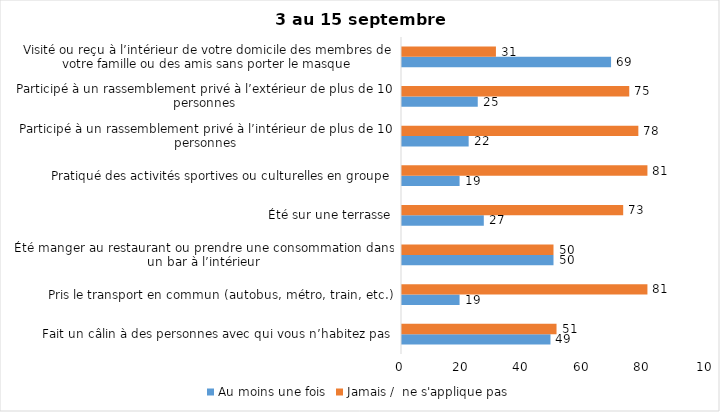
| Category | Au moins une fois | Jamais /  ne s'applique pas |
|---|---|---|
| Fait un câlin à des personnes avec qui vous n’habitez pas | 49 | 51 |
| Pris le transport en commun (autobus, métro, train, etc.) | 19 | 81 |
| Été manger au restaurant ou prendre une consommation dans un bar à l’intérieur | 50 | 50 |
| Été sur une terrasse | 27 | 73 |
| Pratiqué des activités sportives ou culturelles en groupe | 19 | 81 |
| Participé à un rassemblement privé à l’intérieur de plus de 10 personnes | 22 | 78 |
| Participé à un rassemblement privé à l’extérieur de plus de 10 personnes | 25 | 75 |
| Visité ou reçu à l’intérieur de votre domicile des membres de votre famille ou des amis sans porter le masque | 69 | 31 |